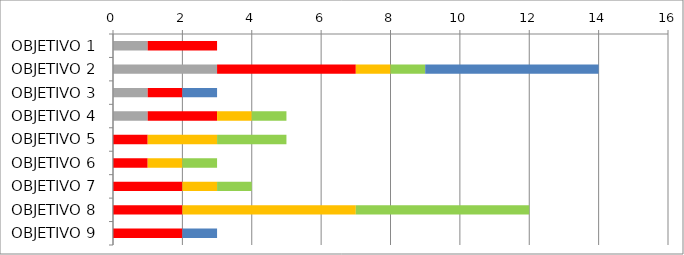
| Category | Series 1 | Series 2 | Series 3 | Series 4 | série6 |
|---|---|---|---|---|---|
| OBJETIVO 1 | 1 | 2 | 0 | 0 | 0 |
| OBJETIVO 2 | 3 | 4 | 1 | 1 | 5 |
| OBJETIVO 3 | 1 | 1 | 0 | 0 | 1 |
| OBJETIVO 4 | 1 | 2 | 1 | 1 | 0 |
| OBJETIVO 5 | 0 | 1 | 2 | 2 | 0 |
| OBJETIVO 6 | 0 | 1 | 1 | 1 | 0 |
| OBJETIVO 7 | 0 | 2 | 1 | 1 | 0 |
| OBJETIVO 8 | 0 | 2 | 5 | 5 | 0 |
| OBJETIVO 9 | 0 | 2 | 0 | 0 | 1 |